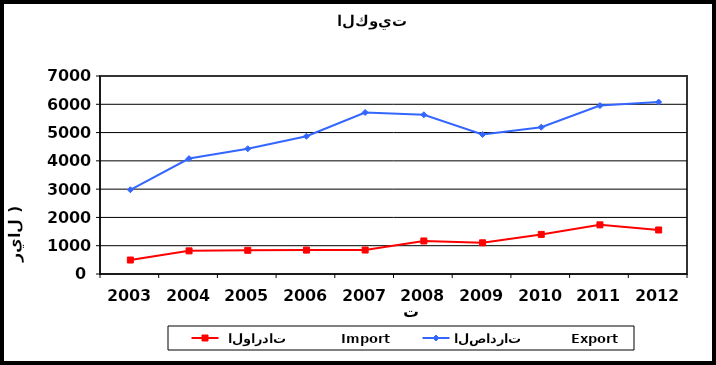
| Category |  الواردات           Import | الصادرات          Export |
|---|---|---|
| 2003.0 | 494 | 2978 |
| 2004.0 | 818 | 4081 |
| 2005.0 | 837 | 4428 |
| 2006.0 | 845 | 4869 |
| 2007.0 | 847 | 5711 |
| 2008.0 | 1168 | 5629 |
| 2009.0 | 1103 | 4932 |
| 2010.0 | 1400 | 5189 |
| 2011.0 | 1738 | 5954 |
| 2012.0 | 1556 | 6078 |